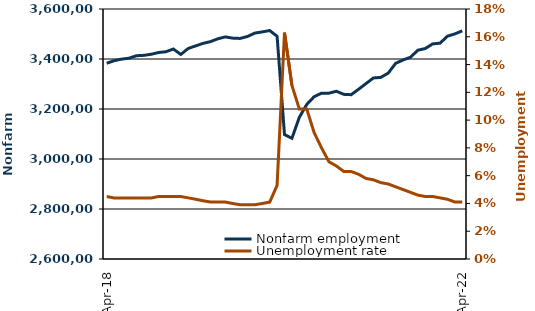
| Category |  Nonfarm employment  |
|---|---|
| 2018-04-01 | 3382900 |
| 2018-05-01 | 3393200 |
| 2018-06-01 | 3399500 |
| 2018-07-01 | 3403100 |
| 2018-08-01 | 3413000 |
| 2018-09-01 | 3414600 |
| 2018-10-01 | 3418900 |
| 2018-11-01 | 3425900 |
| 2018-12-01 | 3429100 |
| 2019-01-01 | 3439900 |
| 2019-02-01 | 3418200 |
| 2019-03-01 | 3442100 |
| 2019-04-01 | 3452400 |
| 2019-05-01 | 3462400 |
| 2019-06-01 | 3469500 |
| 2019-07-01 | 3480800 |
| 2019-08-01 | 3488400 |
| 2019-09-01 | 3483500 |
| 2019-10-01 | 3482300 |
| 2019-11-01 | 3490000 |
| 2019-12-01 | 3503700 |
| 2020-01-01 | 3508400 |
| 2020-02-01 | 3514000 |
| 2020-03-01 | 3490900 |
| 2020-04-01 | 3097600 |
| 2020-05-01 | 3082700 |
| 2020-06-01 | 3166600 |
| 2020-07-01 | 3218200 |
| 2020-08-01 | 3249200 |
| 2020-09-01 | 3263300 |
| 2020-10-01 | 3263300 |
| 2020-11-01 | 3271000 |
| 2020-12-01 | 3258600 |
| 2021-01-01 | 3257300 |
| 2021-02-01 | 3279000 |
| 2021-03-01 | 3301600 |
| 2021-04-01 | 3324200 |
| 2021-05-01 | 3326500 |
| 2021-06-01 | 3343600 |
| 2021-07-01 | 3382500 |
| 2021-08-01 | 3396100 |
| 2021-09-01 | 3407000 |
| 2021-10-01 | 3435100 |
| 2021-11-01 | 3441900 |
| 2021-12-01 | 3460400 |
| 2022-01-01 | 3463400 |
| 2022-02-01 | 3491400 |
| 2022-03-01 | 3500400 |
| 2022-04-01 | 3512700 |